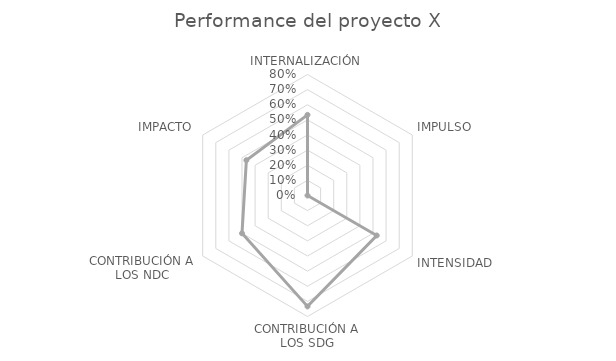
| Category | Series 2 |
|---|---|
| INTERNALIZACIÓN | 0.533 |
| IMPULSO | 0 |
| INTENSIDAD | 0.529 |
| CONTRIBUCIÓN A LOS SDG | 0.733 |
| CONTRIBUCIÓN A LOS NDC | 0.5 |
| IMPACTO | 0.467 |